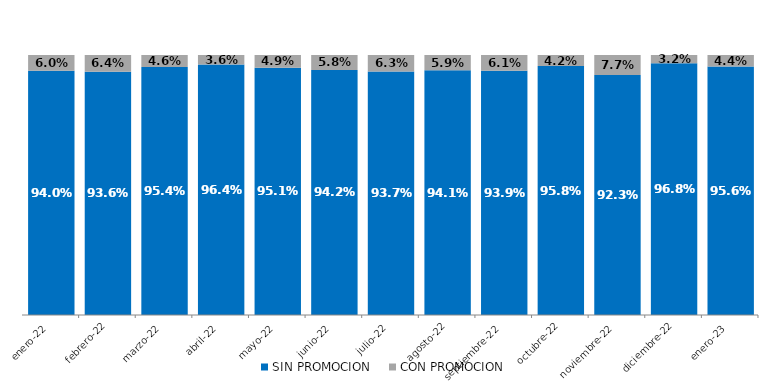
| Category | SIN PROMOCION   | CON PROMOCION   |
|---|---|---|
| 2022-01-01 | 0.94 | 0.06 |
| 2022-02-01 | 0.936 | 0.064 |
| 2022-03-01 | 0.954 | 0.046 |
| 2022-04-01 | 0.964 | 0.036 |
| 2022-05-01 | 0.951 | 0.049 |
| 2022-06-01 | 0.942 | 0.058 |
| 2022-07-01 | 0.937 | 0.063 |
| 2022-08-01 | 0.941 | 0.059 |
| 2022-09-01 | 0.939 | 0.061 |
| 2022-10-01 | 0.958 | 0.042 |
| 2022-11-01 | 0.923 | 0.077 |
| 2022-12-01 | 0.968 | 0.032 |
| 2023-01-01 | 0.956 | 0.044 |